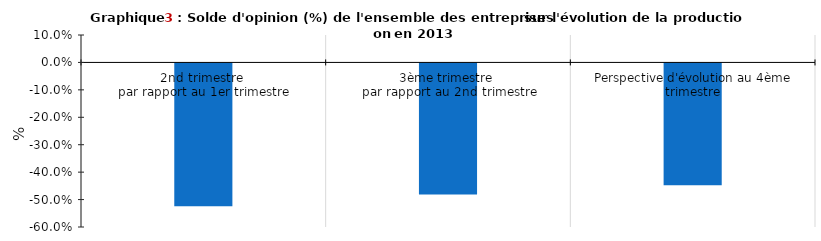
| Category |       Solde d'opinion (%) |
|---|---|
| 2nd trimestre 
par rapport au 1er trimestre | -0.521 |
| 3ème trimestre 
par rapport au 2nd trimestre | -0.478 |
| Perspective d'évolution au 4ème trimestre | -0.444 |